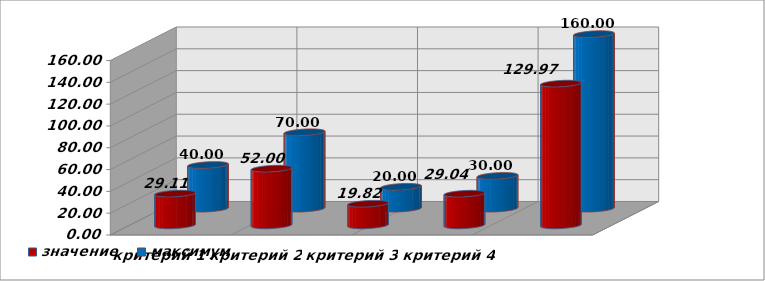
| Category | значение | максимум |
|---|---|---|
| критерий 1 | 29.11 | 40 |
| критерий 2 | 52 | 70 |
| критерий 3 | 19.82 | 20 |
| критерий 4 | 29.04 | 30 |